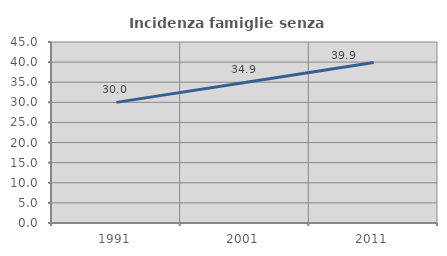
| Category | Incidenza famiglie senza nuclei |
|---|---|
| 1991.0 | 29.991 |
| 2001.0 | 34.943 |
| 2011.0 | 39.91 |